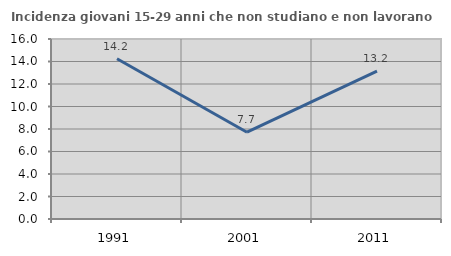
| Category | Incidenza giovani 15-29 anni che non studiano e non lavorano  |
|---|---|
| 1991.0 | 14.244 |
| 2001.0 | 7.714 |
| 2011.0 | 13.152 |